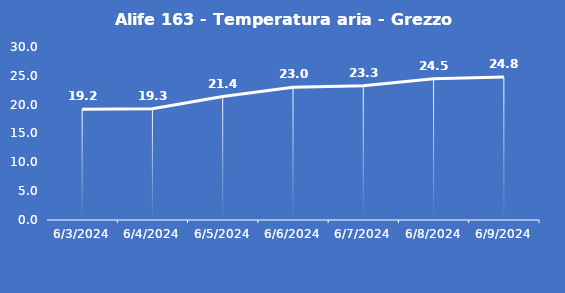
| Category | Alife 163 - Temperatura aria - Grezzo (°C) |
|---|---|
| 6/3/24 | 19.2 |
| 6/4/24 | 19.3 |
| 6/5/24 | 21.4 |
| 6/6/24 | 23 |
| 6/7/24 | 23.3 |
| 6/8/24 | 24.5 |
| 6/9/24 | 24.8 |